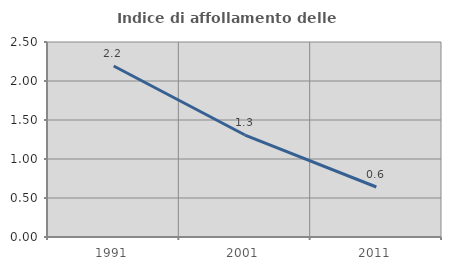
| Category | Indice di affollamento delle abitazioni  |
|---|---|
| 1991.0 | 2.192 |
| 2001.0 | 1.307 |
| 2011.0 | 0.641 |